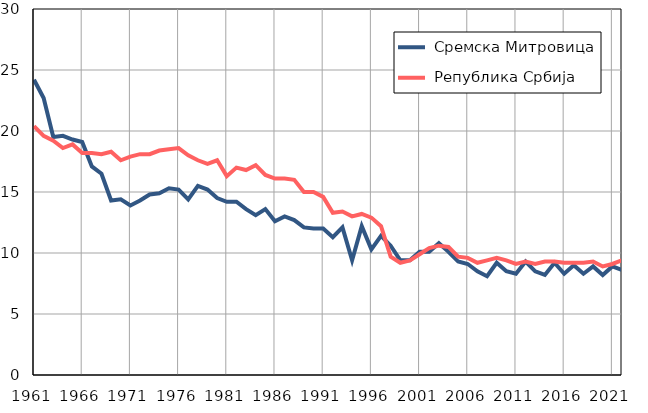
| Category |  Сремска Митровица |  Република Србија |
|---|---|---|
| 1961.0 | 24.2 | 20.4 |
| 1962.0 | 22.7 | 19.6 |
| 1963.0 | 19.5 | 19.2 |
| 1964.0 | 19.6 | 18.6 |
| 1965.0 | 19.3 | 18.9 |
| 1966.0 | 19.1 | 18.2 |
| 1967.0 | 17.1 | 18.2 |
| 1968.0 | 16.5 | 18.1 |
| 1969.0 | 14.3 | 18.3 |
| 1970.0 | 14.4 | 17.6 |
| 1971.0 | 13.9 | 17.9 |
| 1972.0 | 14.3 | 18.1 |
| 1973.0 | 14.8 | 18.1 |
| 1974.0 | 14.9 | 18.4 |
| 1975.0 | 15.3 | 18.5 |
| 1976.0 | 15.2 | 18.6 |
| 1977.0 | 14.4 | 18 |
| 1978.0 | 15.5 | 17.6 |
| 1979.0 | 15.2 | 17.3 |
| 1980.0 | 14.5 | 17.6 |
| 1981.0 | 14.2 | 16.3 |
| 1982.0 | 14.2 | 17 |
| 1983.0 | 13.6 | 16.8 |
| 1984.0 | 13.1 | 17.2 |
| 1985.0 | 13.6 | 16.4 |
| 1986.0 | 12.6 | 16.1 |
| 1987.0 | 13 | 16.1 |
| 1988.0 | 12.7 | 16 |
| 1989.0 | 12.1 | 15 |
| 1990.0 | 12 | 15 |
| 1991.0 | 12 | 14.6 |
| 1992.0 | 11.3 | 13.3 |
| 1993.0 | 12.1 | 13.4 |
| 1994.0 | 9.4 | 13 |
| 1995.0 | 12.2 | 13.2 |
| 1996.0 | 10.3 | 12.9 |
| 1997.0 | 11.4 | 12.2 |
| 1998.0 | 10.6 | 9.7 |
| 1999.0 | 9.4 | 9.2 |
| 2000.0 | 9.4 | 9.4 |
| 2001.0 | 10.1 | 9.9 |
| 2002.0 | 10.1 | 10.4 |
| 2003.0 | 10.8 | 10.6 |
| 2004.0 | 10.1 | 10.5 |
| 2005.0 | 9.3 | 9.7 |
| 2006.0 | 9.1 | 9.6 |
| 2007.0 | 8.5 | 9.2 |
| 2008.0 | 8.1 | 9.4 |
| 2009.0 | 9.2 | 9.6 |
| 2010.0 | 8.5 | 9.4 |
| 2011.0 | 8.3 | 9.1 |
| 2012.0 | 9.3 | 9.3 |
| 2013.0 | 8.5 | 9.1 |
| 2014.0 | 8.2 | 9.3 |
| 2015.0 | 9.2 | 9.3 |
| 2016.0 | 8.3 | 9.2 |
| 2017.0 | 9 | 9.2 |
| 2018.0 | 8.3 | 9.2 |
| 2019.0 | 8.9 | 9.3 |
| 2020.0 | 8.2 | 8.9 |
| 2021.0 | 8.9 | 9.1 |
| 2022.0 | 8.6 | 9.4 |